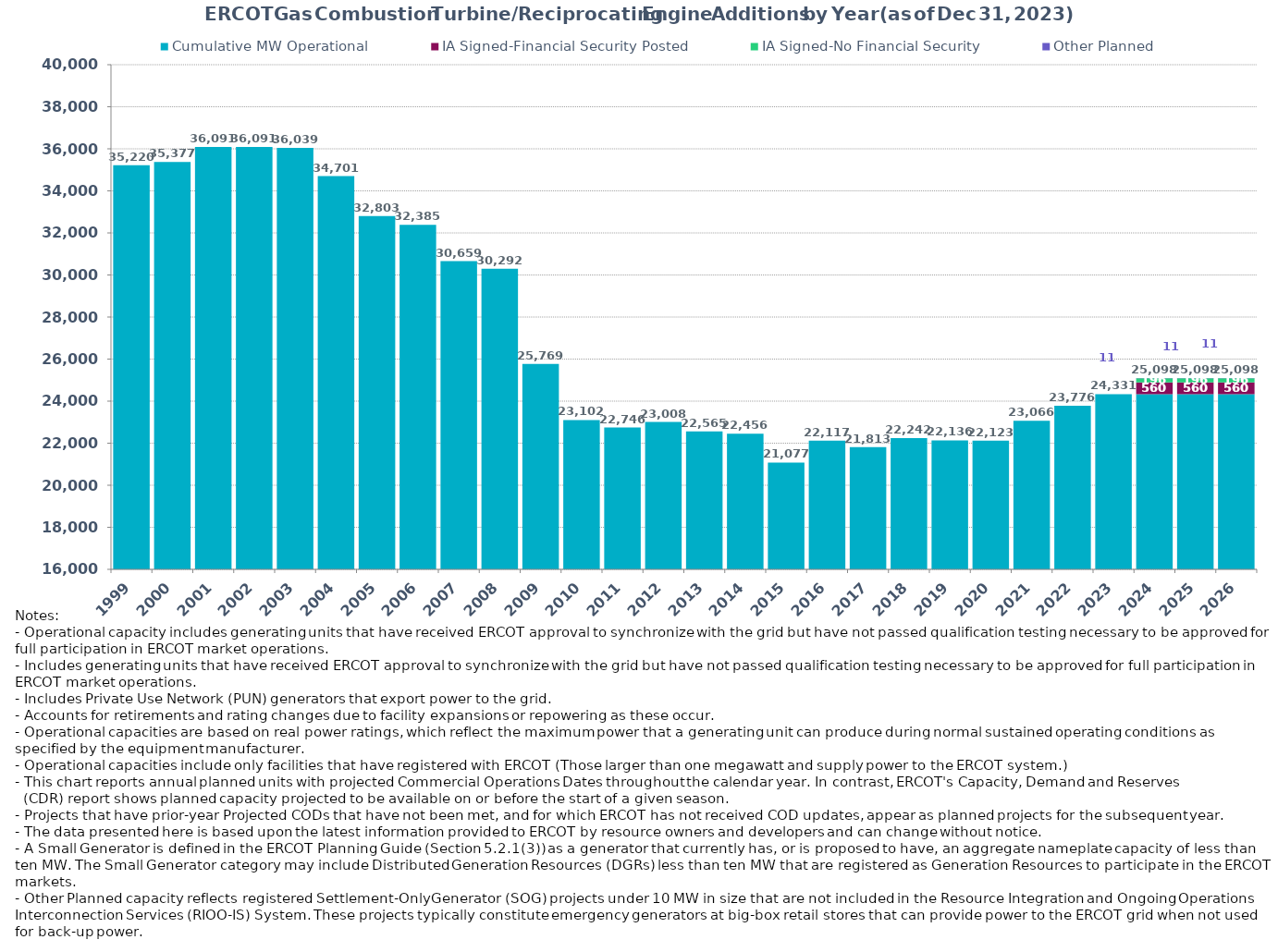
| Category | Cumulative MW Operational | IA Signed-Financial Security Posted | IA Signed-No Financial Security  | Other Planned | Cumulative Installed and Planned |
|---|---|---|---|---|---|
| 1999.0 | 35219.87 | 0 | 0 | 0 | 35219.87 |
| 2000.0 | 35377.48 | 0 | 0 | 0 | 35377.48 |
| 2001.0 | 36091.14 | 0 | 0 | 0 | 36091.14 |
| 2002.0 | 36091.14 | 0 | 0 | 0 | 36091.14 |
| 2003.0 | 36039.14 | 0 | 0 | 0 | 36039.14 |
| 2004.0 | 34701.24 | 0 | 0 | 0 | 34701.24 |
| 2005.0 | 32803.04 | 0 | 0 | 0 | 32803.04 |
| 2006.0 | 32385.14 | 0 | 0 | 0 | 32385.14 |
| 2007.0 | 30659.14 | 0 | 0 | 0 | 30659.14 |
| 2008.0 | 30291.94 | 0 | 0 | 0 | 30291.94 |
| 2009.0 | 25769.37 | 0 | 0 | 0 | 25769.37 |
| 2010.0 | 23102.25 | 0 | 0 | 0 | 23102.25 |
| 2011.0 | 22745.55 | 0 | 0 | 0 | 22745.55 |
| 2012.0 | 23007.75 | 0 | 0 | 0 | 23007.75 |
| 2013.0 | 22564.91 | 0 | 0 | 0 | 22564.91 |
| 2014.0 | 22455.91 | 0 | 0 | 0 | 22455.91 |
| 2015.0 | 21077.11 | 0 | 0 | 0 | 21077.11 |
| 2016.0 | 22117.49 | 0 | 0 | 0 | 22117.49 |
| 2017.0 | 21812.63 | 0 | 0 | 0 | 21812.63 |
| 2018.0 | 22241.79 | 0 | 0 | 0 | 22241.79 |
| 2019.0 | 22136.49 | 0 | 0 | 0 | 22136.49 |
| 2020.0 | 22123.49 | 0 | 0 | 0 | 22123.49 |
| 2021.0 | 23065.69 | 0 | 0 | 0 | 23065.69 |
| 2022.0 | 23775.84 | 0 | 0 | 0 | 23775.84 |
| 2023.0 | 24331.04 | 0 | 0 | 0 | 24331.04 |
| 2024.0 | 24331.04 | 560 | 196 | 10.8 | 25097.84 |
| 2025.0 | 24331.04 | 560 | 196 | 10.8 | 25097.84 |
| 2026.0 | 24331.04 | 560 | 196 | 10.8 | 25097.84 |